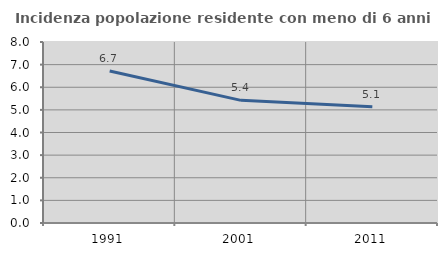
| Category | Incidenza popolazione residente con meno di 6 anni |
|---|---|
| 1991.0 | 6.721 |
| 2001.0 | 5.42 |
| 2011.0 | 5.141 |